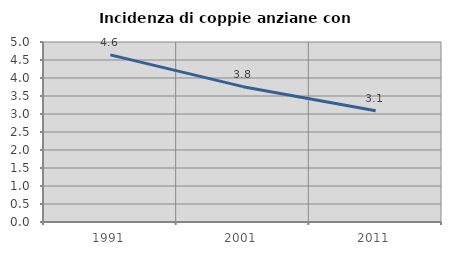
| Category | Incidenza di coppie anziane con figli |
|---|---|
| 1991.0 | 4.641 |
| 2001.0 | 3.759 |
| 2011.0 | 3.093 |